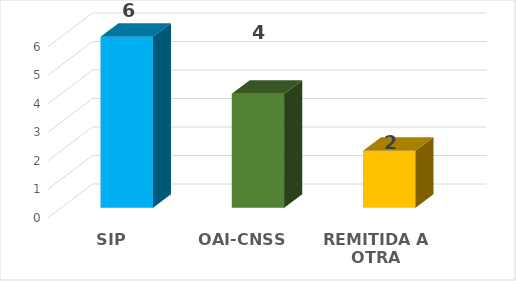
| Category | Series 0 |
|---|---|
| SIP | 6 |
| OAI-CNSS | 4 |
| REMITIDA A OTRA ENTIDAD | 2 |